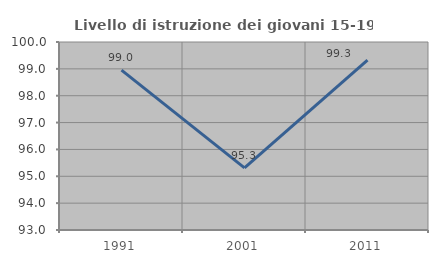
| Category | Livello di istruzione dei giovani 15-19 anni |
|---|---|
| 1991.0 | 98.953 |
| 2001.0 | 95.312 |
| 2011.0 | 99.329 |